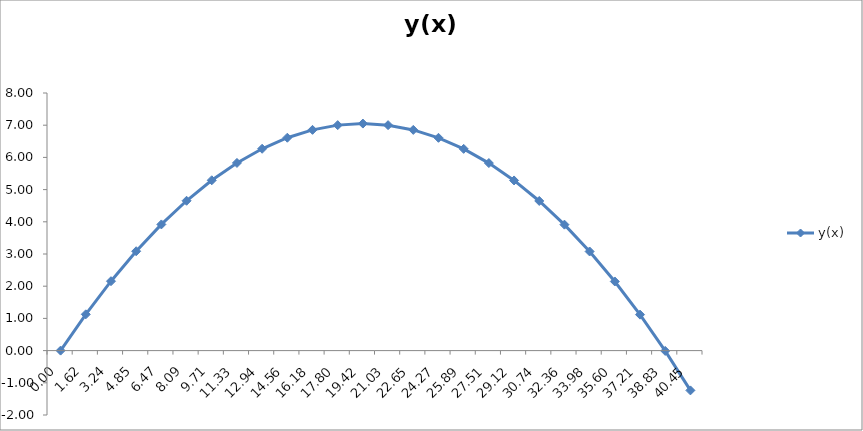
| Category | y(x) |
|---|---|
| 0.0 | 0 |
| 1.618033988749895 | 1.127 |
| 3.23606797749979 | 2.155 |
| 4.854101966249686 | 3.086 |
| 6.47213595499958 | 3.918 |
| 8.090169943749475 | 4.653 |
| 9.70820393249937 | 5.289 |
| 11.326237921249264 | 5.828 |
| 12.944271909999157 | 6.269 |
| 14.562305898749052 | 6.611 |
| 16.180339887498945 | 6.856 |
| 17.798373876248842 | 7.002 |
| 19.41640786499874 | 7.051 |
| 21.034441853748636 | 7.001 |
| 22.652475842498532 | 6.854 |
| 24.27050983124843 | 6.609 |
| 25.888543819998322 | 6.265 |
| 27.50657780874822 | 5.824 |
| 29.124611797498115 | 5.284 |
| 30.742645786248012 | 4.647 |
| 32.360679774997905 | 3.911 |
| 33.9787137637478 | 3.078 |
| 35.5967477524977 | 2.147 |
| 37.21478174124759 | 1.117 |
| 38.83281572999749 | -0.01 |
| 40.450849718747385 | -1.236 |